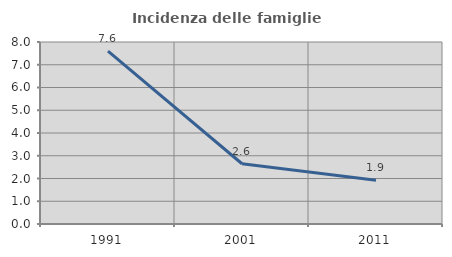
| Category | Incidenza delle famiglie numerose |
|---|---|
| 1991.0 | 7.599 |
| 2001.0 | 2.649 |
| 2011.0 | 1.921 |